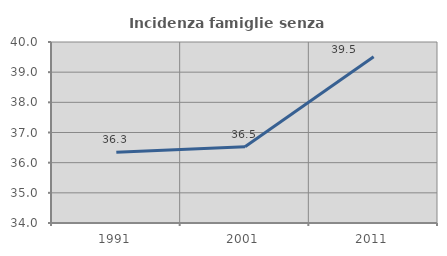
| Category | Incidenza famiglie senza nuclei |
|---|---|
| 1991.0 | 36.346 |
| 2001.0 | 36.527 |
| 2011.0 | 39.511 |